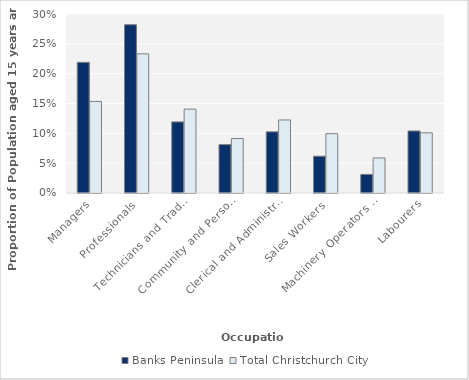
| Category | Banks Peninsula | Total Christchurch City |
|---|---|---|
| Managers | 0.219 | 0.153 |
| Professionals | 0.282 | 0.233 |
| Technicians and Trades Workers | 0.119 | 0.141 |
| Community and Personal Service Workers | 0.081 | 0.091 |
| Clerical and Administrative Workers | 0.103 | 0.122 |
| Sales Workers | 0.062 | 0.099 |
| Machinery Operators and Drivers | 0.031 | 0.059 |
| Labourers | 0.104 | 0.101 |